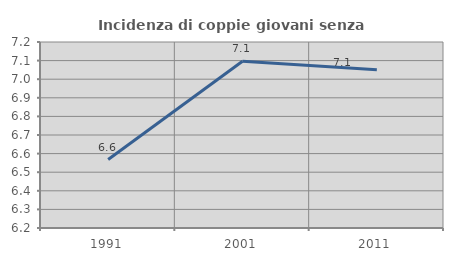
| Category | Incidenza di coppie giovani senza figli |
|---|---|
| 1991.0 | 6.568 |
| 2001.0 | 7.096 |
| 2011.0 | 7.05 |